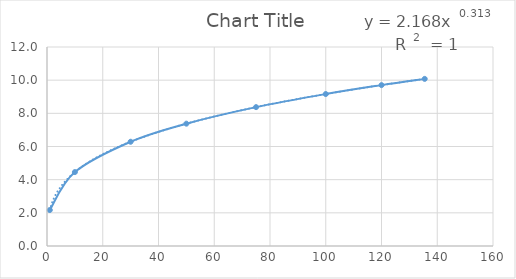
| Category | Series 0 |
|---|---|
| 1.0 | 2.168 |
| 10.0 | 4.457 |
| 30.0 | 6.286 |
| 50.0 | 7.376 |
| 75.0 | 8.374 |
| 100.0 | 9.163 |
| 120.0 | 9.702 |
| 135.5 | 10.078 |